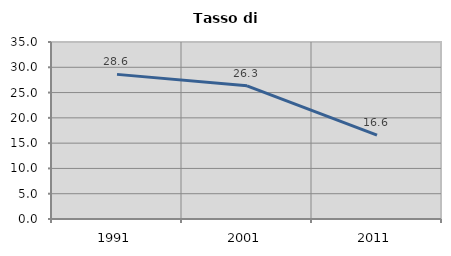
| Category | Tasso di disoccupazione   |
|---|---|
| 1991.0 | 28.598 |
| 2001.0 | 26.341 |
| 2011.0 | 16.602 |